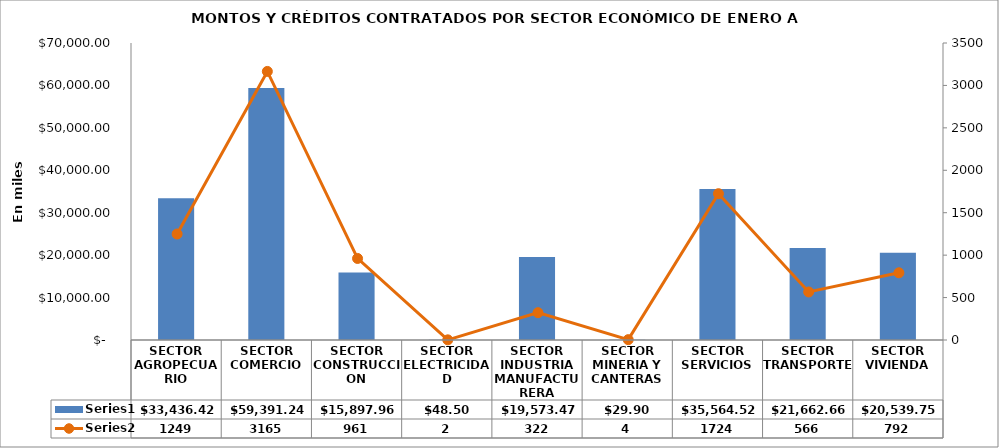
| Category | Series 0 |
|---|---|
| SECTOR AGROPECUARIO | 33436.423 |
| SECTOR COMERCIO | 59391.24 |
| SECTOR CONSTRUCCION | 15897.961 |
| SECTOR ELECTRICIDAD | 48.5 |
| SECTOR INDUSTRIA MANUFACTURERA | 19573.467 |
| SECTOR MINERIA Y CANTERAS | 29.9 |
| SECTOR SERVICIOS | 35564.524 |
| SECTOR TRANSPORTE | 21662.659 |
| SECTOR VIVIENDA | 20539.75 |